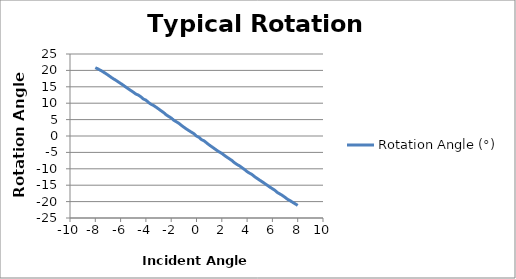
| Category | Rotation Angle (°) |
|---|---|
| -8.0 | 20.831 |
| -7.8 | 20.458 |
| -7.6 | 20.055 |
| -7.4 | 19.593 |
| -7.2 | 19.103 |
| -7.0 | 18.588 |
| -6.8 | 18.045 |
| -6.6 | 17.513 |
| -6.4 | 17.057 |
| -6.2 | 16.538 |
| -6.0 | 16.032 |
| -5.8 | 15.517 |
| -5.6 | 14.951 |
| -5.4 | 14.415 |
| -5.2 | 13.89 |
| -5.0 | 13.378 |
| -4.8 | 12.821 |
| -4.6 | 12.469 |
| -4.4 | 11.948 |
| -4.2 | 11.295 |
| -4.0 | 10.924 |
| -3.8 | 10.256 |
| -3.6 | 9.689 |
| -3.4 | 9.312 |
| -3.2 | 8.806 |
| -3.0 | 8.249 |
| -2.8 | 7.693 |
| -2.6 | 7.143 |
| -2.4 | 6.475 |
| -2.2 | 5.969 |
| -2.0 | 5.492 |
| -1.8 | 4.826 |
| -1.6 | 4.355 |
| -1.4 | 3.883 |
| -1.2 | 3.259 |
| -1.0 | 2.688 |
| -0.8 | 2.149 |
| -0.6 | 1.637 |
| -0.4 | 1.166 |
| -0.2 | 0.671 |
| 0.0 | -0.029 |
| 0.2 | -0.428 |
| 0.4 | -1.109 |
| 0.6 | -1.491 |
| 0.8 | -2.107 |
| 1.0 | -2.714 |
| 1.2 | -3.248 |
| 1.4 | -3.798 |
| 1.6 | -4.357 |
| 1.8 | -4.86 |
| 2.0 | -5.297 |
| 2.2 | -5.893 |
| 2.4 | -6.444 |
| 2.6 | -6.955 |
| 2.8 | -7.479 |
| 3.0 | -8.145 |
| 3.2 | -8.673 |
| 3.4 | -9.111 |
| 3.6 | -9.669 |
| 3.8 | -10.221 |
| 4.0 | -10.861 |
| 4.2 | -11.338 |
| 4.4 | -11.784 |
| 4.6 | -12.417 |
| 4.8 | -12.951 |
| 5.0 | -13.471 |
| 5.2 | -13.978 |
| 5.4 | -14.503 |
| 5.6 | -15.044 |
| 5.8 | -15.576 |
| 6.0 | -16.071 |
| 6.2 | -16.58 |
| 6.4 | -17.233 |
| 6.6 | -17.682 |
| 6.8 | -18.152 |
| 7.0 | -18.707 |
| 7.2 | -19.288 |
| 7.4 | -19.724 |
| 7.6 | -20.212 |
| 7.8 | -20.685 |
| 8.0 | -21.151 |